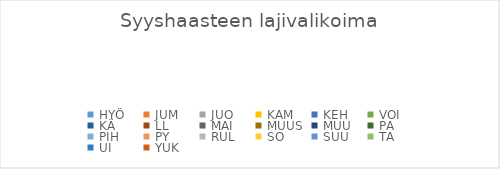
| Category | Series 0 |
|---|---|
| HYÖ | 0 |
| JUM | 0 |
| JUO | 0 |
| KAM | 0 |
| KEH | 0 |
| VOI | 0 |
| KÄ | 0 |
| LL | 0 |
| MAI | 0 |
| MUUS | 0 |
| MUU | 0 |
| PA | 0 |
| PIH | 0 |
| PY | 0 |
| RUL | 0 |
| SO | 0 |
| SUU | 0 |
| TA | 0 |
| UI | 0 |
| YUK | 0 |